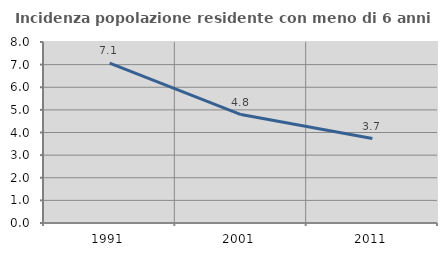
| Category | Incidenza popolazione residente con meno di 6 anni |
|---|---|
| 1991.0 | 7.067 |
| 2001.0 | 4.793 |
| 2011.0 | 3.732 |